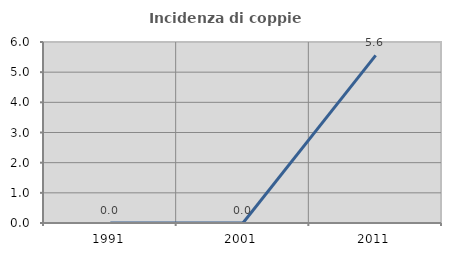
| Category | Incidenza di coppie miste |
|---|---|
| 1991.0 | 0 |
| 2001.0 | 0 |
| 2011.0 | 5.556 |